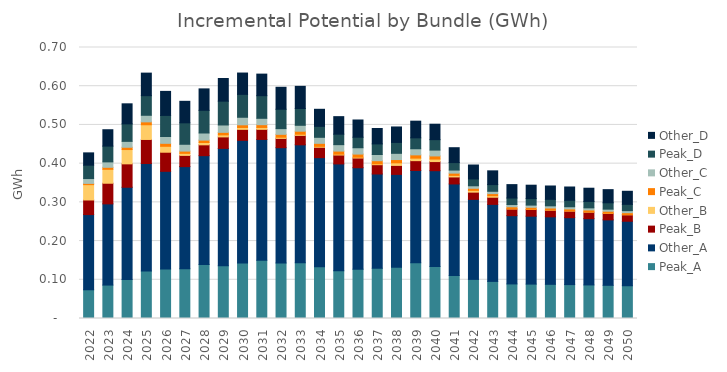
| Category | Peak_A | Other_A | Peak_B | Other_B | Peak_C | Other_C | Peak_D | Other_D |
|---|---|---|---|---|---|---|---|---|
| 2022.0 | 0.074 | 0.194 | 0.038 | 0.04 | 0.003 | 0.013 | 0.035 | 0.032 |
| 2023.0 | 0.086 | 0.21 | 0.053 | 0.036 | 0.005 | 0.014 | 0.041 | 0.042 |
| 2024.0 | 0.101 | 0.238 | 0.06 | 0.037 | 0.006 | 0.015 | 0.045 | 0.052 |
| 2025.0 | 0.123 | 0.278 | 0.062 | 0.038 | 0.007 | 0.017 | 0.051 | 0.058 |
| 2026.0 | 0.128 | 0.252 | 0.049 | 0.015 | 0.008 | 0.018 | 0.054 | 0.062 |
| 2027.0 | 0.129 | 0.264 | 0.029 | 0.005 | 0.006 | 0.018 | 0.055 | 0.056 |
| 2028.0 | 0.14 | 0.281 | 0.028 | 0.006 | 0.006 | 0.018 | 0.059 | 0.055 |
| 2029.0 | 0.136 | 0.303 | 0.03 | 0.005 | 0.007 | 0.019 | 0.061 | 0.059 |
| 2030.0 | 0.144 | 0.317 | 0.028 | 0.005 | 0.007 | 0.019 | 0.059 | 0.055 |
| 2031.0 | 0.15 | 0.312 | 0.026 | 0.005 | 0.007 | 0.016 | 0.058 | 0.056 |
| 2032.0 | 0.143 | 0.298 | 0.024 | 0.003 | 0.007 | 0.015 | 0.05 | 0.057 |
| 2033.0 | 0.144 | 0.305 | 0.024 | 0.003 | 0.008 | 0.015 | 0.043 | 0.057 |
| 2034.0 | 0.134 | 0.282 | 0.027 | 0.002 | 0.008 | 0.016 | 0.028 | 0.044 |
| 2035.0 | 0.123 | 0.276 | 0.023 | 0.002 | 0.008 | 0.017 | 0.027 | 0.045 |
| 2036.0 | 0.127 | 0.262 | 0.025 | 0.002 | 0.008 | 0.016 | 0.027 | 0.045 |
| 2037.0 | 0.13 | 0.244 | 0.024 | 0.002 | 0.008 | 0.016 | 0.027 | 0.04 |
| 2038.0 | 0.132 | 0.24 | 0.023 | 0.007 | 0.009 | 0.016 | 0.028 | 0.04 |
| 2039.0 | 0.144 | 0.239 | 0.025 | 0.007 | 0.008 | 0.016 | 0.028 | 0.043 |
| 2040.0 | 0.135 | 0.247 | 0.024 | 0.006 | 0.008 | 0.015 | 0.027 | 0.04 |
| 2041.0 | 0.111 | 0.237 | 0.018 | 0.004 | 0.006 | 0.008 | 0.019 | 0.038 |
| 2042.0 | 0.101 | 0.207 | 0.019 | 0.005 | 0.005 | 0.007 | 0.018 | 0.036 |
| 2043.0 | 0.096 | 0.199 | 0.018 | 0.004 | 0.005 | 0.006 | 0.017 | 0.036 |
| 2044.0 | 0.089 | 0.176 | 0.017 | 0 | 0.005 | 0.006 | 0.017 | 0.035 |
| 2045.0 | 0.089 | 0.175 | 0.017 | 0 | 0.005 | 0.006 | 0.017 | 0.035 |
| 2046.0 | 0.088 | 0.174 | 0.017 | 0 | 0.005 | 0.006 | 0.017 | 0.034 |
| 2047.0 | 0.088 | 0.173 | 0.017 | 0 | 0.005 | 0.006 | 0.017 | 0.034 |
| 2048.0 | 0.087 | 0.171 | 0.017 | 0 | 0.005 | 0.005 | 0.017 | 0.034 |
| 2049.0 | 0.086 | 0.169 | 0.017 | 0 | 0.005 | 0.005 | 0.016 | 0.034 |
| 2050.0 | 0.085 | 0.167 | 0.017 | 0 | 0.005 | 0.005 | 0.016 | 0.034 |